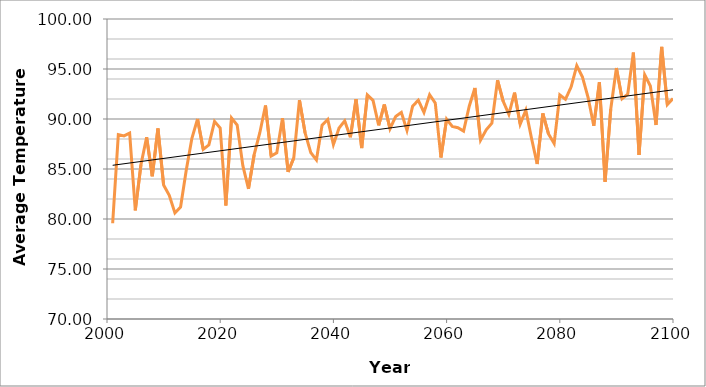
| Category | A2 |
|---|---|
| 2001.0 | 79.578 |
| 2002.0 | 88.446 |
| 2003.0 | 88.308 |
| 2004.0 | 88.583 |
| 2005.0 | 80.863 |
| 2006.0 | 85.438 |
| 2007.0 | 88.178 |
| 2008.0 | 84.27 |
| 2009.0 | 89.049 |
| 2010.0 | 83.403 |
| 2011.0 | 82.369 |
| 2012.0 | 80.604 |
| 2013.0 | 81.198 |
| 2014.0 | 84.868 |
| 2015.0 | 88.068 |
| 2016.0 | 90.007 |
| 2017.0 | 86.968 |
| 2018.0 | 87.409 |
| 2019.0 | 89.764 |
| 2020.0 | 89.098 |
| 2021.0 | 81.349 |
| 2022.0 | 90.104 |
| 2023.0 | 89.398 |
| 2024.0 | 85.332 |
| 2025.0 | 83.017 |
| 2026.0 | 86.436 |
| 2027.0 | 88.63 |
| 2028.0 | 91.346 |
| 2029.0 | 86.288 |
| 2030.0 | 86.616 |
| 2031.0 | 90.082 |
| 2032.0 | 84.708 |
| 2033.0 | 86.106 |
| 2034.0 | 91.89 |
| 2035.0 | 88.612 |
| 2036.0 | 86.643 |
| 2037.0 | 85.906 |
| 2038.0 | 89.388 |
| 2039.0 | 89.951 |
| 2040.0 | 87.447 |
| 2041.0 | 89.1 |
| 2042.0 | 89.811 |
| 2043.0 | 88.174 |
| 2044.0 | 91.989 |
| 2045.0 | 87.096 |
| 2046.0 | 92.404 |
| 2047.0 | 91.87 |
| 2048.0 | 89.366 |
| 2049.0 | 91.445 |
| 2050.0 | 89.02 |
| 2051.0 | 90.252 |
| 2052.0 | 90.658 |
| 2053.0 | 88.864 |
| 2054.0 | 91.288 |
| 2055.0 | 91.877 |
| 2056.0 | 90.658 |
| 2057.0 | 92.426 |
| 2058.0 | 91.593 |
| 2059.0 | 86.149 |
| 2060.0 | 89.987 |
| 2061.0 | 89.253 |
| 2062.0 | 89.134 |
| 2063.0 | 88.794 |
| 2064.0 | 91.276 |
| 2065.0 | 93.101 |
| 2066.0 | 87.886 |
| 2067.0 | 88.911 |
| 2068.0 | 89.587 |
| 2069.0 | 93.882 |
| 2070.0 | 91.773 |
| 2071.0 | 90.468 |
| 2072.0 | 92.638 |
| 2073.0 | 89.497 |
| 2074.0 | 90.887 |
| 2075.0 | 88.07 |
| 2076.0 | 85.496 |
| 2077.0 | 90.556 |
| 2078.0 | 88.513 |
| 2079.0 | 87.552 |
| 2080.0 | 92.41 |
| 2081.0 | 91.972 |
| 2082.0 | 93.205 |
| 2083.0 | 95.34 |
| 2084.0 | 94.208 |
| 2085.0 | 92.138 |
| 2086.0 | 89.321 |
| 2087.0 | 93.677 |
| 2088.0 | 83.723 |
| 2089.0 | 90.977 |
| 2090.0 | 95.095 |
| 2091.0 | 92.032 |
| 2092.0 | 92.476 |
| 2093.0 | 96.643 |
| 2094.0 | 86.401 |
| 2095.0 | 94.422 |
| 2096.0 | 93.297 |
| 2097.0 | 89.4 |
| 2098.0 | 97.218 |
| 2099.0 | 91.45 |
| 2100.0 | 92.046 |